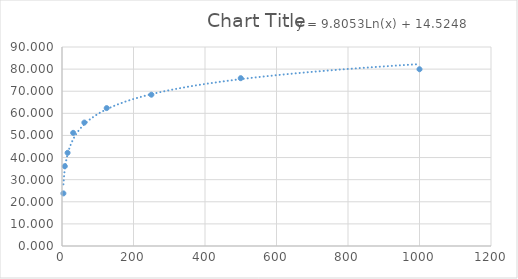
| Category | Series 0 |
|---|---|
| 3.91 | 23.795 |
| 7.81 | 36.081 |
| 15.62 | 42.146 |
| 31.25 | 51.166 |
| 62.5 | 55.832 |
| 125.0 | 62.364 |
| 250.0 | 68.429 |
| 500.0 | 75.894 |
| 1000.0 | 79.938 |